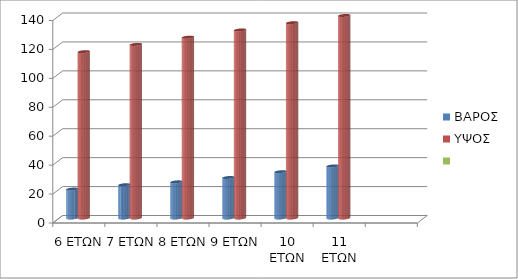
| Category | ΒΑΡΟΣ | ΥΨΟΣ | Series 2 |
|---|---|---|---|
| 6 ΕΤΩΝ | 20 | 115 |  |
| 7 ΕΤΩΝ | 23 | 120 |  |
| 8 ΕΤΩΝ | 25 | 125 |  |
| 9 ΕΤΩΝ | 28 | 130 |  |
| 10 ΕΤΩΝ | 32 | 135 |  |
| 11 ΕΤΩΝ | 36 | 140 |  |